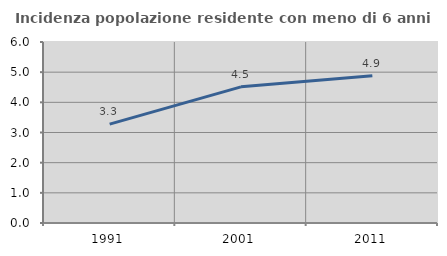
| Category | Incidenza popolazione residente con meno di 6 anni |
|---|---|
| 1991.0 | 3.278 |
| 2001.0 | 4.514 |
| 2011.0 | 4.882 |